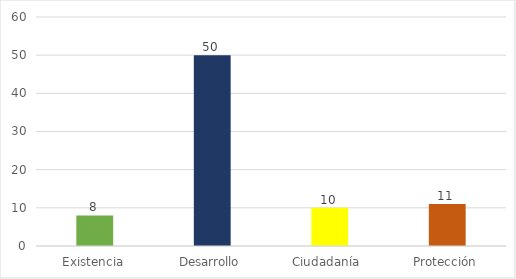
| Category | METAS CUMPLIDAS |
|---|---|
| Existencia | 8 |
| Desarrollo | 50 |
| Ciudadanía  | 10 |
| Protección | 11 |